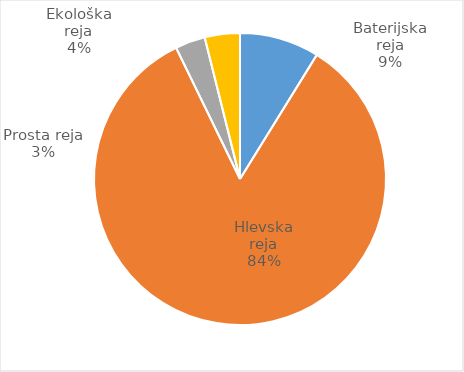
| Category | Število kosov jajc |
|---|---|
| Baterijska reja | 304245 |
| Hlevska reja | 2895889 |
| Prosta reja | 114354 |
| Ekološka reja | 134340 |